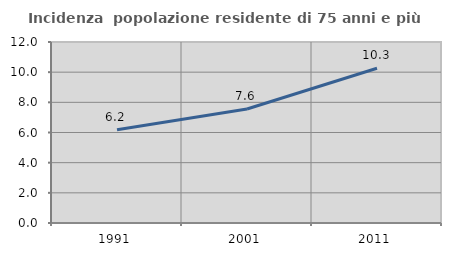
| Category | Incidenza  popolazione residente di 75 anni e più |
|---|---|
| 1991.0 | 6.178 |
| 2001.0 | 7.558 |
| 2011.0 | 10.261 |